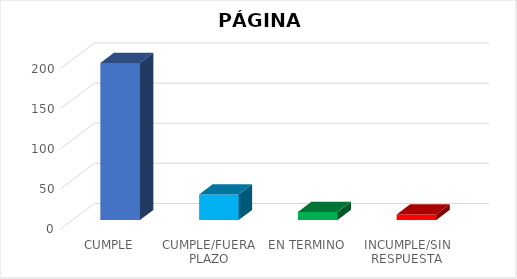
| Category | TOTAL |
|---|---|
| CUMPLE | 196 |
| CUMPLE/FUERA PLAZO | 32 |
| EN TERMINO | 10 |
| INCUMPLE/SIN RESPUESTA | 7 |